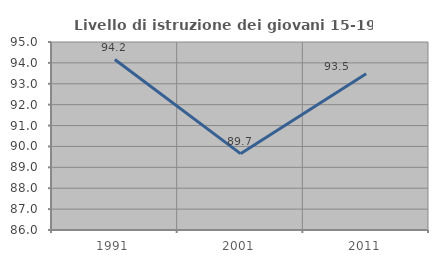
| Category | Livello di istruzione dei giovani 15-19 anni |
|---|---|
| 1991.0 | 94.161 |
| 2001.0 | 89.655 |
| 2011.0 | 93.478 |